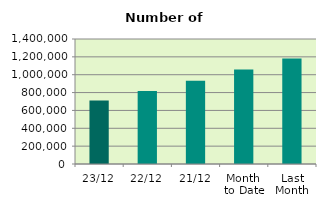
| Category | Series 0 |
|---|---|
| 23/12 | 712552 |
| 22/12 | 817220 |
| 21/12 | 931990 |
| Month 
to Date | 1058350.118 |
| Last
Month | 1182027.273 |